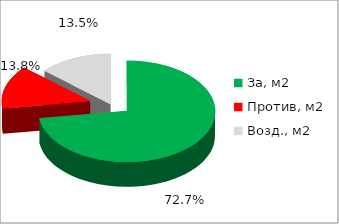
| Category | Series 0 |
|---|---|
| За, м2 | 0.727 |
| Против, м2 | 0.138 |
| Возд., м2 | 0.135 |